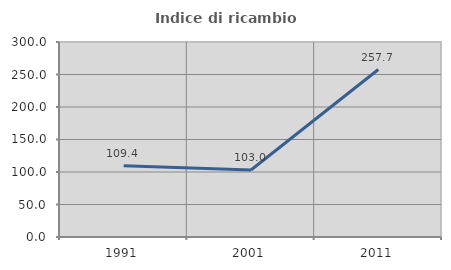
| Category | Indice di ricambio occupazionale  |
|---|---|
| 1991.0 | 109.434 |
| 2001.0 | 103.03 |
| 2011.0 | 257.692 |